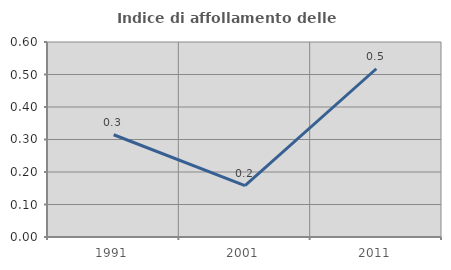
| Category | Indice di affollamento delle abitazioni  |
|---|---|
| 1991.0 | 0.315 |
| 2001.0 | 0.158 |
| 2011.0 | 0.518 |